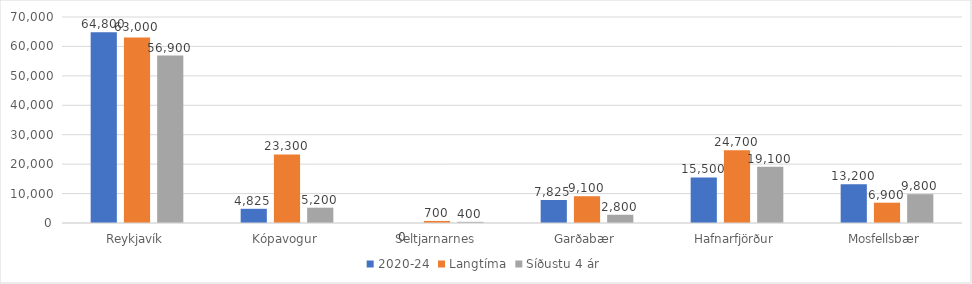
| Category | 2020-24 | Langtíma | Síðustu 4 ár |
|---|---|---|---|
| Reykjavík | 64800 | 63000 | 56900 |
| Kópavogur | 4825 | 23300 | 5200 |
| Seltjarnarnes | 0 | 700 | 400 |
| Garðabær | 7825 | 9100 | 2800 |
| Hafnarfjörður | 15500 | 24700 | 19100 |
| Mosfellsbær | 13200 | 6900 | 9800 |